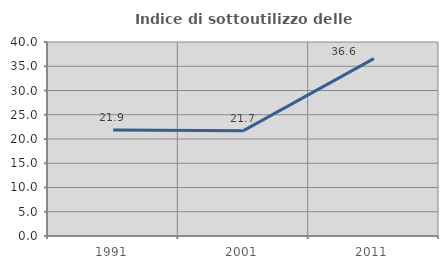
| Category | Indice di sottoutilizzo delle abitazioni  |
|---|---|
| 1991.0 | 21.864 |
| 2001.0 | 21.716 |
| 2011.0 | 36.573 |